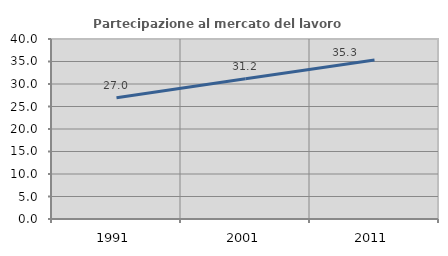
| Category | Partecipazione al mercato del lavoro  femminile |
|---|---|
| 1991.0 | 26.961 |
| 2001.0 | 31.174 |
| 2011.0 | 35.341 |